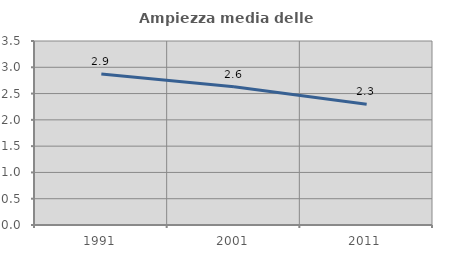
| Category | Ampiezza media delle famiglie |
|---|---|
| 1991.0 | 2.873 |
| 2001.0 | 2.631 |
| 2011.0 | 2.298 |